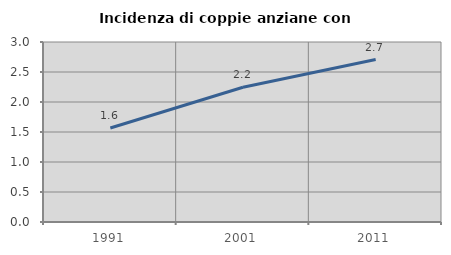
| Category | Incidenza di coppie anziane con figli |
|---|---|
| 1991.0 | 1.566 |
| 2001.0 | 2.245 |
| 2011.0 | 2.707 |